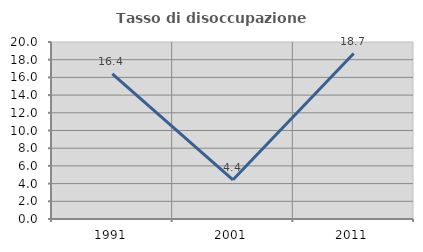
| Category | Tasso di disoccupazione giovanile  |
|---|---|
| 1991.0 | 16.387 |
| 2001.0 | 4.43 |
| 2011.0 | 18.692 |